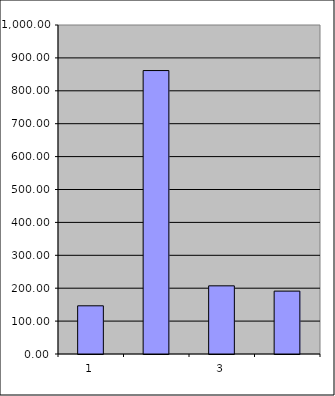
| Category | Series 0 |
|---|---|
| 0 | 146.5 |
| 1 | 861.522 |
| 2 | 207.205 |
| 3 | 191.14 |